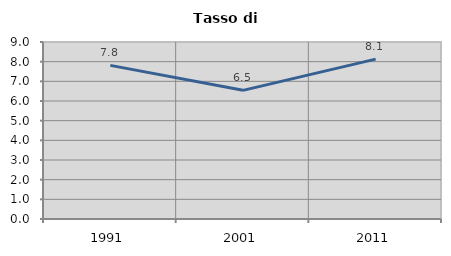
| Category | Tasso di disoccupazione   |
|---|---|
| 1991.0 | 7.812 |
| 2001.0 | 6.542 |
| 2011.0 | 8.13 |